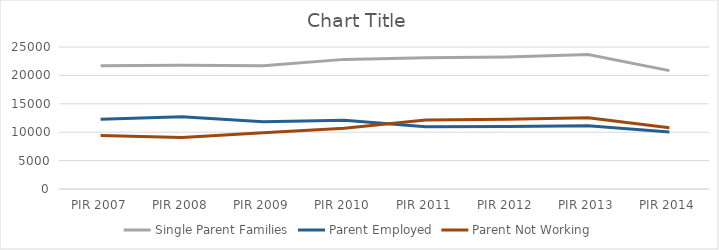
| Category | Single Parent Families | Parent Employed | Parent Not Working |
|---|---|---|---|
| PIR 2007 | 21704 | 12278 | 9426 |
| PIR 2008 | 21774 | 12707 | 9067 |
| PIR 2009 | 21720 | 11827 | 9893 |
| PIR 2010 | 22821 | 12122 | 10699 |
| PIR 2011 | 23103 | 10940 | 12163 |
| PIR 2012 | 23256 | 10991 | 12265 |
| PIR 2013 | 23680 | 11148 | 12532 |
| PIR 2014 | 20837 | 10053 | 10784 |